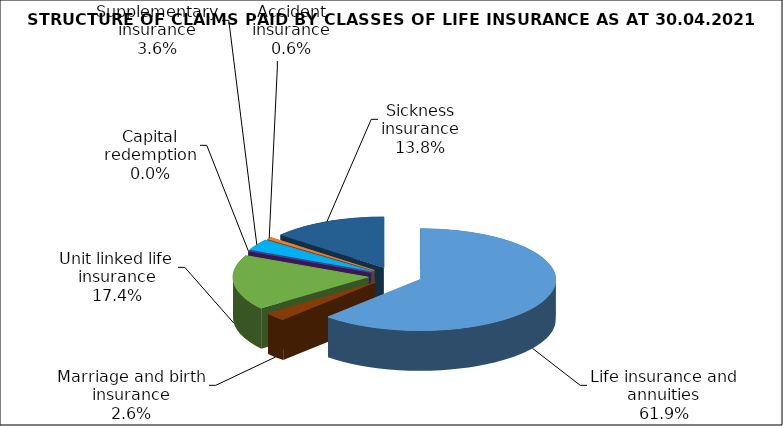
| Category | Series 0 |
|---|---|
| Life insurance and annuities | 47175650.64 |
| Marriage and birth insurance | 2003891.561 |
| Unit linked life insurance | 13293065.298 |
| Capital redemption | 0 |
| Supplementary insurance | 2709087.533 |
| Accident insurance | 488037.413 |
| Sickness insurance | 10530910.443 |